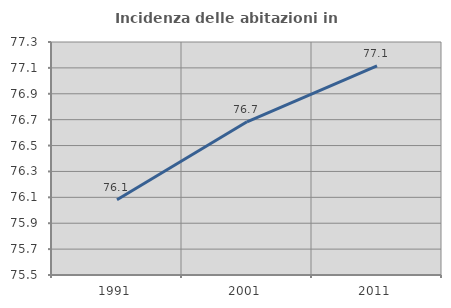
| Category | Incidenza delle abitazioni in proprietà  |
|---|---|
| 1991.0 | 76.081 |
| 2001.0 | 76.684 |
| 2011.0 | 77.116 |